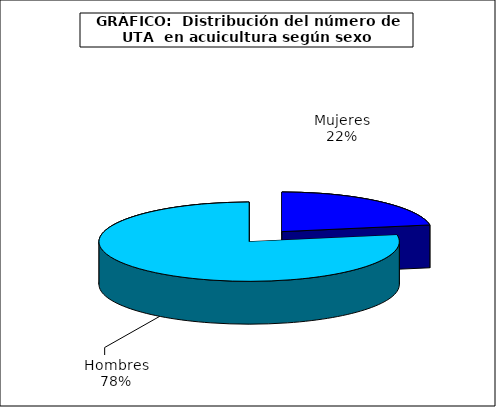
| Category | UTA | Series 1 |
|---|---|---|
| 0 | 1310.679 |  |
| 1 | 4567.004 |  |